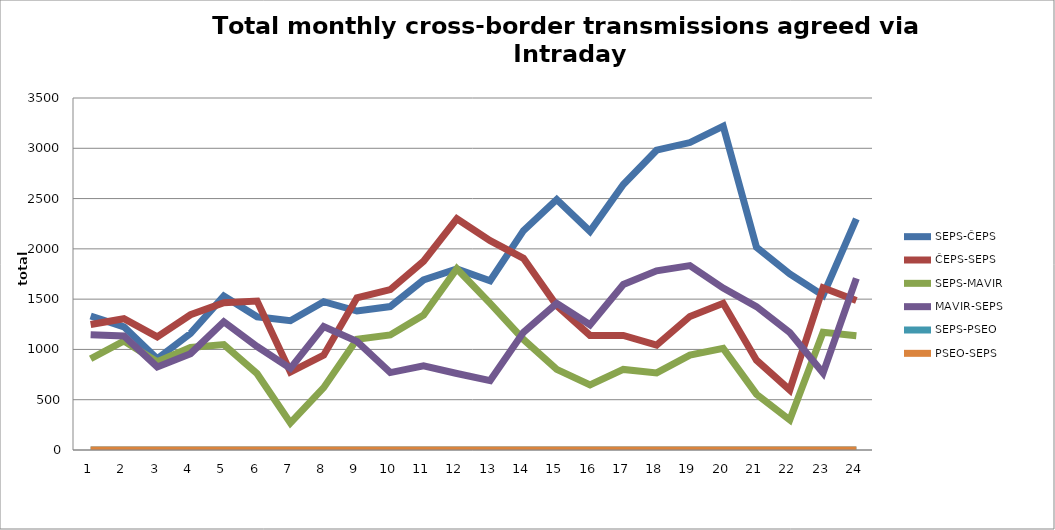
| Category | SEPS-ČEPS | ČEPS-SEPS | SEPS-MAVIR | MAVIR-SEPS | SEPS-PSEO | PSEO-SEPS |
|---|---|---|---|---|---|---|
| 1.0 | 1332 | 1248 | 907 | 1146 | 0 | 0 |
| 2.0 | 1225 | 1305 | 1084 | 1134 | 0 | 0 |
| 3.0 | 908 | 1125 | 877 | 826 | 0 | 0 |
| 4.0 | 1159 | 1345 | 1020 | 958 | 0 | 0 |
| 5.0 | 1530 | 1464 | 1049 | 1275 | 0 | 0 |
| 6.0 | 1324 | 1481 | 759 | 1029 | 0 | 0 |
| 7.0 | 1286 | 775 | 269 | 812 | 0 | 0 |
| 8.0 | 1475 | 943 | 620 | 1228 | 0 | 0 |
| 9.0 | 1382 | 1513 | 1101 | 1080 | 0 | 0 |
| 10.0 | 1426 | 1595 | 1144 | 770 | 0 | 0 |
| 11.0 | 1691 | 1877 | 1342 | 837 | 0 | 0 |
| 12.0 | 1800 | 2299 | 1802 | 761 | 0 | 0 |
| 13.0 | 1683 | 2081 | 1458 | 690 | 0 | 0 |
| 14.0 | 2181 | 1906 | 1099 | 1170 | 0 | 0 |
| 15.0 | 2491 | 1436 | 802 | 1459 | 0 | 0 |
| 16.0 | 2174 | 1139 | 647 | 1245 | 0 | 0 |
| 17.0 | 2639 | 1139 | 801 | 1646 | 0 | 0 |
| 18.0 | 2981 | 1043 | 767 | 1782 | 0 | 0 |
| 19.0 | 3057 | 1328 | 943 | 1833 | 0 | 0 |
| 20.0 | 3220 | 1459 | 1010 | 1610 | 0 | 0 |
| 21.0 | 2016 | 893 | 555 | 1426 | 0 | 0 |
| 22.0 | 1751 | 597 | 299 | 1168 | 0 | 0 |
| 23.0 | 1538 | 1613 | 1171 | 765 | 0 | 0 |
| 24.0 | 2299 | 1486 | 1136 | 1707 | 0 | 0 |